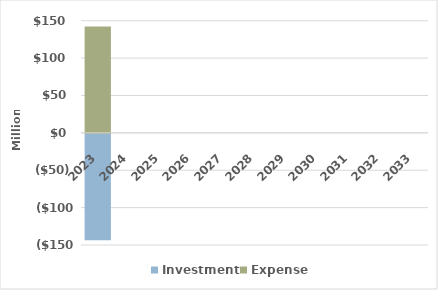
| Category | Investment | Expense |
|---|---|---|
| 2023.0 | -142.26 | 142.26 |
| 2024.0 | 0 | 0 |
| 2025.0 | 0 | 0 |
| 2026.0 | 0 | 0 |
| 2027.0 | 0 | 0 |
| 2028.0 | 0 | 0 |
| 2029.0 | 0 | 0 |
| 2030.0 | 0 | 0 |
| 2031.0 | 0 | 0 |
| 2032.0 | 0 | 0 |
| 2033.0 | 0 | 0 |